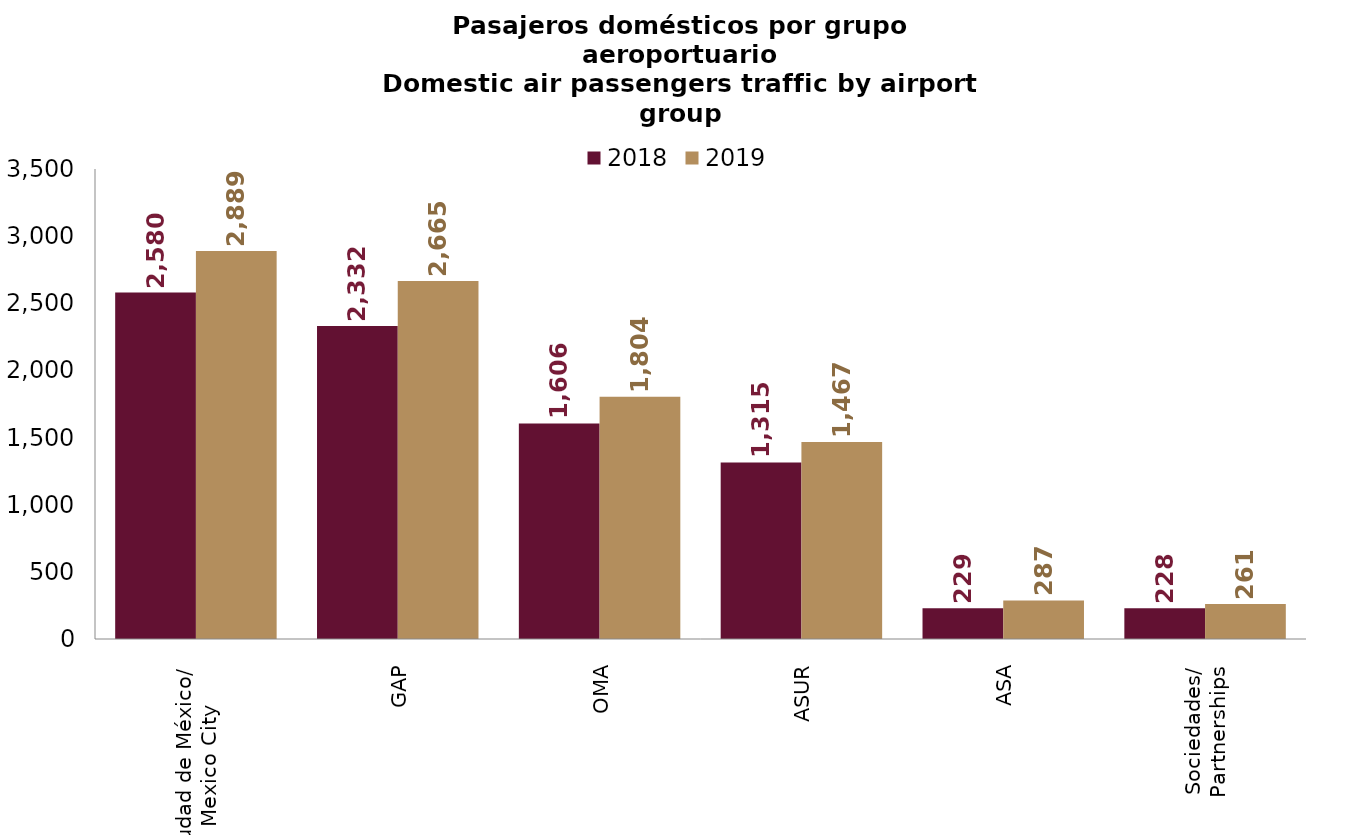
| Category | 2018 | 2019 |
|---|---|---|
| Ciudad de México/
Mexico City | 2580.126 | 2888.679 |
| GAP | 2331.761 | 2665.405 |
| OMA | 1605.624 | 1804.111 |
| ASUR | 1314.755 | 1466.844 |
| ASA | 229.042 | 287.466 |
| Sociedades/
Partnerships | 228.351 | 260.568 |